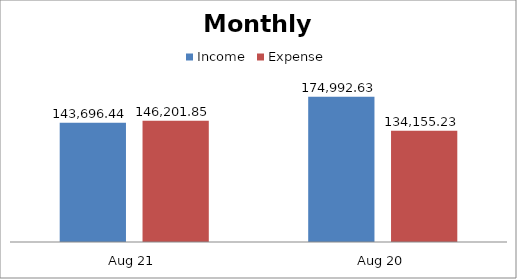
| Category | Income | Expense |
|---|---|---|
| Aug 21 | 143696.44 | 146201.85 |
| Aug 20 | 174992.63 | 134155.23 |